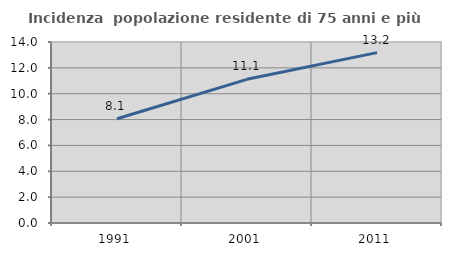
| Category | Incidenza  popolazione residente di 75 anni e più |
|---|---|
| 1991.0 | 8.061 |
| 2001.0 | 11.114 |
| 2011.0 | 13.179 |